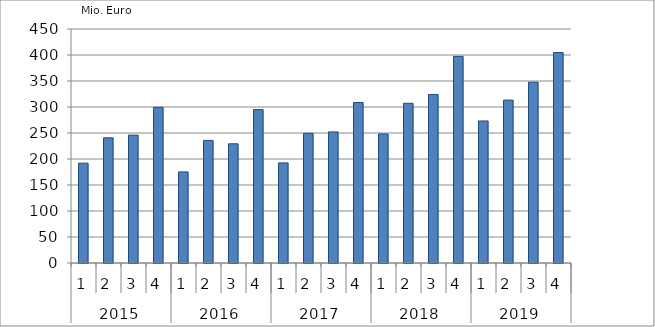
| Category | Ausbaugewerblicher Umsatz3 |
|---|---|
| 0 | 192043.756 |
| 1 | 240826.879 |
| 2 | 245916.087 |
| 3 | 299455.378 |
| 4 | 175225.59 |
| 5 | 235781.631 |
| 6 | 229227.559 |
| 7 | 294992.157 |
| 8 | 192499.539 |
| 9 | 249394.388 |
| 10 | 252146.755 |
| 11 | 308653.153 |
| 12 | 248133.418 |
| 13 | 307099.899 |
| 14 | 324088.989 |
| 15 | 397377.201 |
| 16 | 273159.137 |
| 17 | 313254.251 |
| 18 | 347631.281 |
| 19 | 404721.054 |